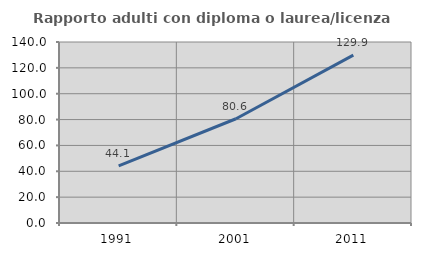
| Category | Rapporto adulti con diploma o laurea/licenza media  |
|---|---|
| 1991.0 | 44.118 |
| 2001.0 | 80.637 |
| 2011.0 | 129.883 |